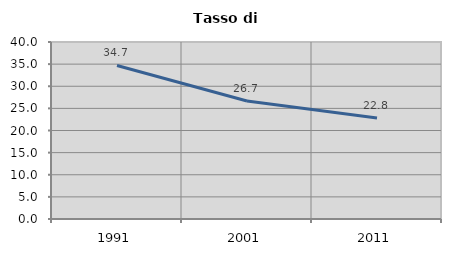
| Category | Tasso di disoccupazione   |
|---|---|
| 1991.0 | 34.7 |
| 2001.0 | 26.662 |
| 2011.0 | 22.834 |